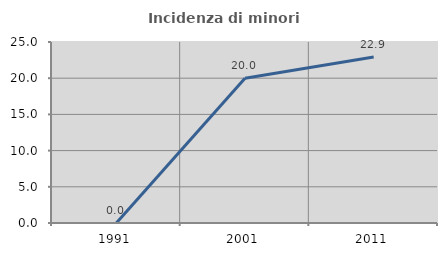
| Category | Incidenza di minori stranieri |
|---|---|
| 1991.0 | 0 |
| 2001.0 | 20 |
| 2011.0 | 22.917 |